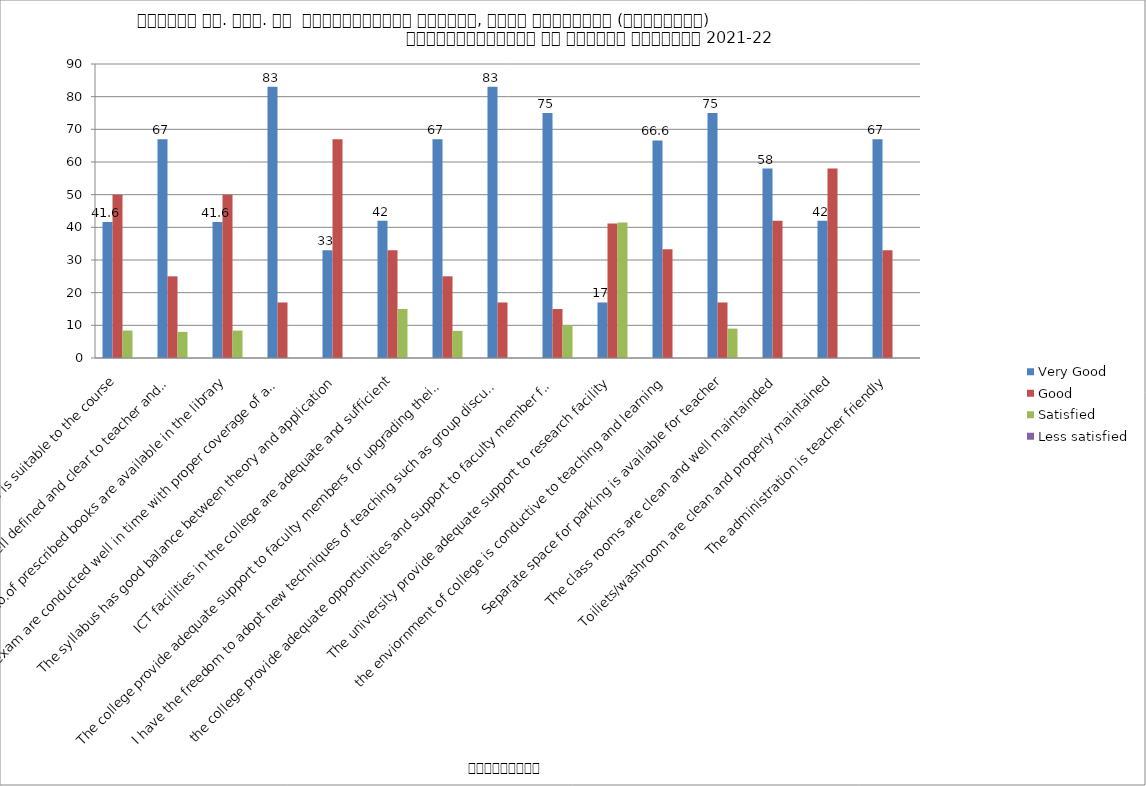
| Category | Very Good | Good | Satisfied | Less satisfied |
|---|---|---|---|---|
| Syllabus is suitable to the course | 41.6 | 50 | 8.4 | 0 |
| Aims and objectives of the syllabus are well defined and clear to teacher and students | 67 | 25 | 8 | 0 |
| Sufficient no.of prescribed books are available in the library | 41.6 | 50 | 8.4 | 0 |
| Test and internal exam are conducted well in time with proper coverage of all units in the syllabus | 83 | 17 | 0 | 0 |
| The syllabus has good balance between theory and application | 33 | 67 | 0 | 0 |
| ICT facilities in the college are adequate and sufficient | 42 | 33 | 15 | 0 |
| The college provide adequate support to faculty members for upgrading their skill and qualification | 67 | 25 | 8.3 | 0 |
| I have the freedom to adopt new techniques of teaching such as group discussion,seminar presentation | 83 | 17 | 0 | 0 |
| the college provide adequate opportunities and support to faculty member for upgrading their skill | 75 | 15 | 10 | 0 |
| The university provide adequate support to research facility | 17 | 41.2 | 41.5 | 0 |
| the enviornment of college is conductive to teaching and learning | 66.6 | 33.3 | 0 | 0 |
| Separate space for parking is available for teacher | 75 | 17 | 9 | 0 |
| The class rooms are clean and well maintainded | 58 | 42 | 0 | 0 |
| Toiliets/washroom are clean and properly maintained | 42 | 58 | 0 | 0 |
| The administration is teacher friendly | 67 | 33 | 0 | 0 |